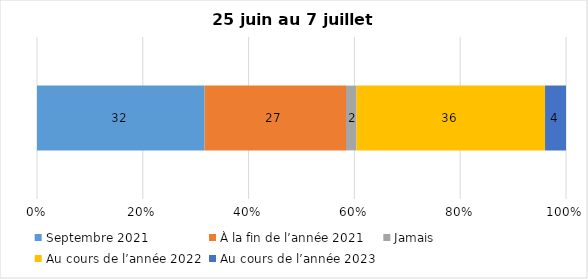
| Category | Septembre 2021 | À la fin de l’année 2021 | Jamais | Au cours de l’année 2022 | Au cours de l’année 2023 |
|---|---|---|---|---|---|
| 0 | 32 | 27 | 2 | 36 | 4 |